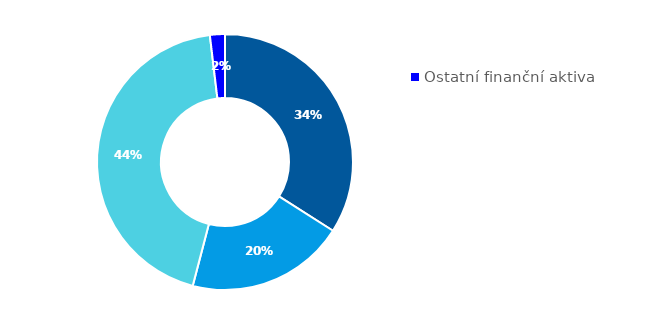
| Category | Series 0 |
|---|---|
| Hotovost | 0.34 |
| Půjčky poskytnuté nemovitostní společnosti | 0.2 |
| Majetkové účasti v nemovitostní společnosti | 0.441 |
| Ostatní finanční aktiva | 0.019 |